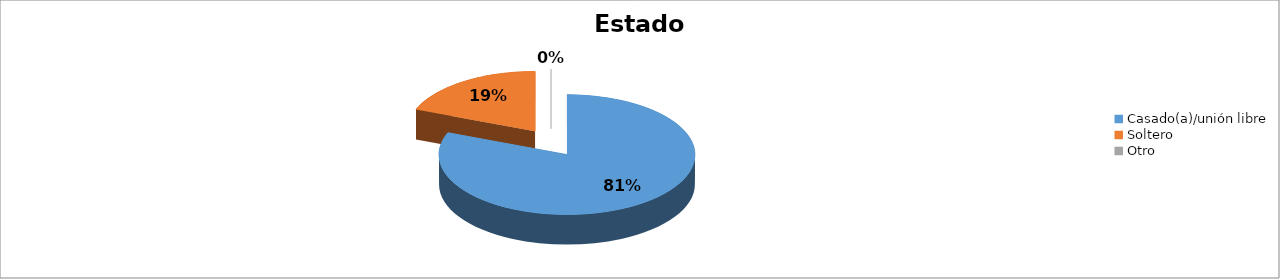
| Category | Series 0 |
|---|---|
| Casado(a)/unión libre | 0.81 |
| Soltero | 0.19 |
| Otro | 0 |